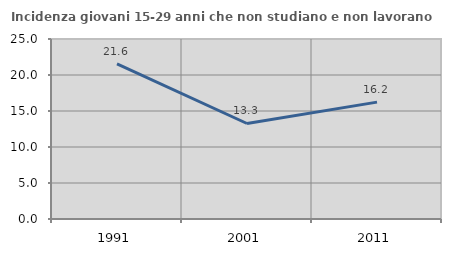
| Category | Incidenza giovani 15-29 anni che non studiano e non lavorano  |
|---|---|
| 1991.0 | 21.553 |
| 2001.0 | 13.265 |
| 2011.0 | 16.23 |